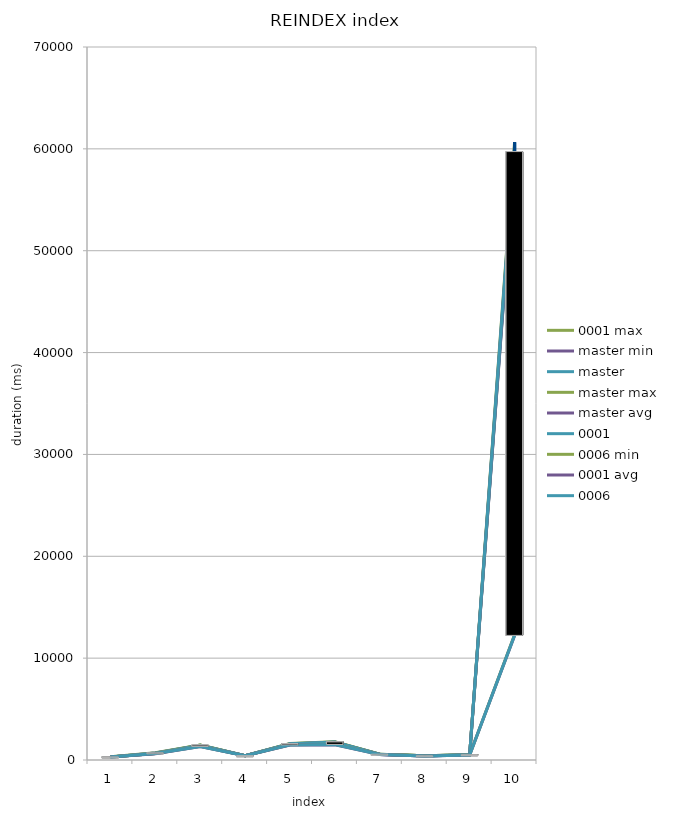
| Category | max | master min | master | avg | 0001 | 0006 min | 0006 |
|---|---|---|---|---|---|---|---|
| 0 | 293.273 | 288.47 | 297.667 | 285.527 | 288.841 | 302.924 | 294.615 |
| 1 | 654.552 | 683.124 | 698.754 | 623.037 | 640.764 | 646.787 | 635.022 |
| 2 | 1468.527 | 1415.113 | 1444.141 | 1317.913 | 1444.624 | 1343.943 | 1333.625 |
| 3 | 428.782 | 415.908 | 421.958 | 412.396 | 418.702 | 425.542 | 419.878 |
| 4 | 1605.947 | 1544.213 | 1579.713 | 1461.266 | 1584.538 | 1499.703 | 1482.941 |
| 5 | 1763.647 | 1709.225 | 1746.665 | 1506.004 | 1754.73 | 1543.407 | 1527.382 |
| 6 | 559.975 | 550.933 | 564.518 | 542.96 | 555.161 | 554.876 | 547.314 |
| 7 | 406.326 | 406.738 | 413.506 | 395.664 | 403.755 | 407.288 | 399.954 |
| 8 | 513.101 | 493.127 | 508.947 | 495.642 | 506.712 | 500.335 | 498.215 |
| 9 | 60639.764 | 59372.211 | 59590.226 | 12201.788 | 60319.87 | 12290.126 | 12232.669 |